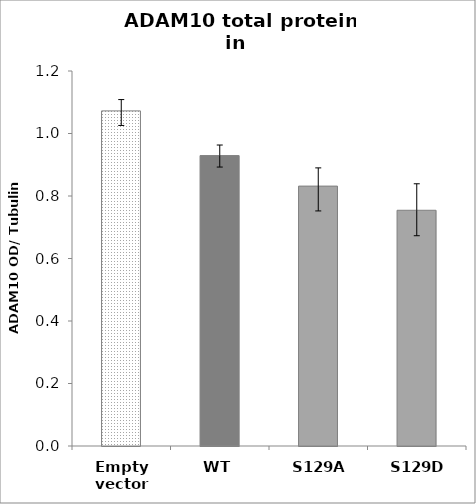
| Category | Series 0 |
|---|---|
| Empty vector | 1.072 |
| WT | 0.929 |
| S129A | 0.832 |
| S129D | 0.754 |